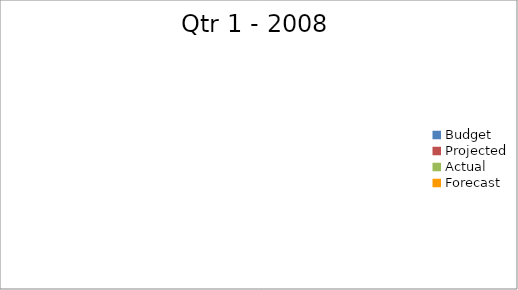
| Category | Series 0 |
|---|---|
| Budget | 760 |
| Projected | 2380 |
| Actual | 620 |
| Forecast | 2480 |